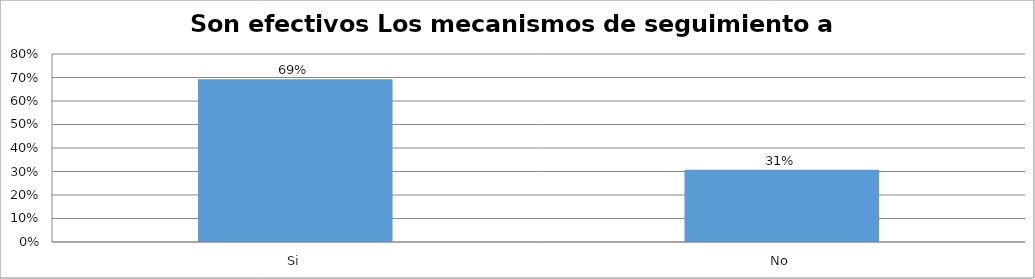
| Category | Series 0 |
|---|---|
| Si | 0.692 |
| No | 0.308 |